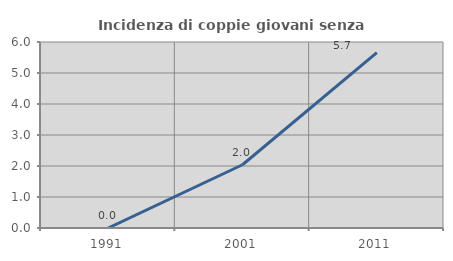
| Category | Incidenza di coppie giovani senza figli |
|---|---|
| 1991.0 | 0 |
| 2001.0 | 2.041 |
| 2011.0 | 5.66 |